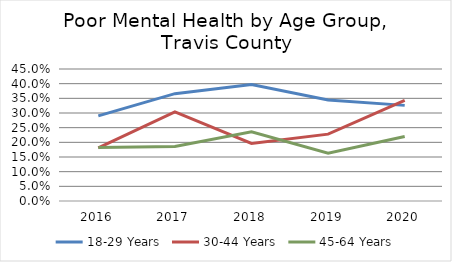
| Category | 18-29 Years  | 30-44 Years  | 45-64 Years |
|---|---|---|---|
| 2016.0 | 0.29 | 0.181 | 0.182 |
| 2017.0 | 0.366 | 0.304 | 0.186 |
| 2018.0 | 0.397 | 0.196 | 0.236 |
| 2019.0 | 0.344 | 0.228 | 0.163 |
| 2020.0 | 0.326 | 0.343 | 0.22 |